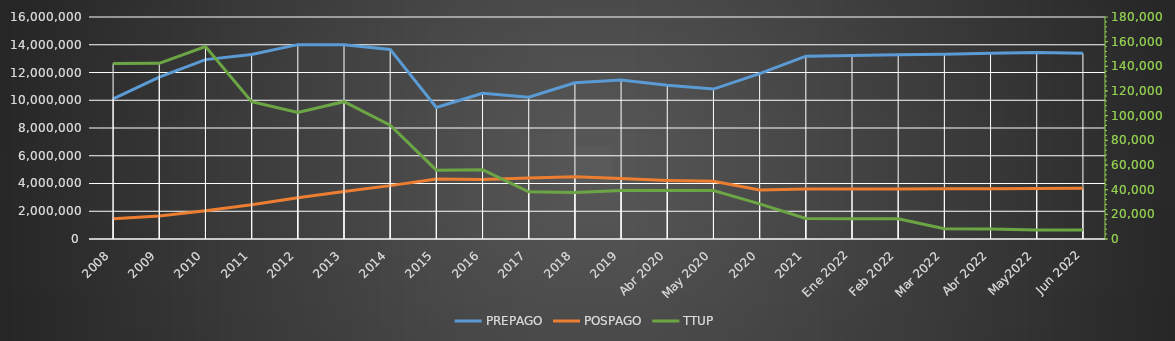
| Category | PREPAGO | POSPAGO |
|---|---|---|
| 2008 | 10097768 | 1452088 |
| 2009 | 11662294 | 1649838 |
| 2010 | 12929040 | 2033814 |
| 2011 | 13295834 | 2467378 |
| 2012 | 14008104 | 2976194 |
| 2013 | 14005126 | 3425277 |
| 2014 | 13666071 | 3846271 |
| 2015 | 9476240 | 4326937 |
| 2016 | 10498467 | 4293426 |
| 2017 | 10219457 | 4393703 |
| 2018 | 11254168 | 4480975 |
| 2019 | 11462048 | 4351686 |
| Abr 2020 | 11073657 | 4217911 |
| May 2020 | 10806656 | 4155948 |
| 2020 | 11917697 | 3539192 |
| 2021 | 13174530 | 3598383 |
| Ene 2022 | 13220510 | 3611202 |
| Feb 2022 | 13277237 | 3612124 |
| Mar 2022 | 13319621 | 3621700 |
| Abr 2022 | 13391496 | 3628201 |
| May2022 | 13434704 | 3642700 |
| Jun 2022 | 13396249 | 3652440 |